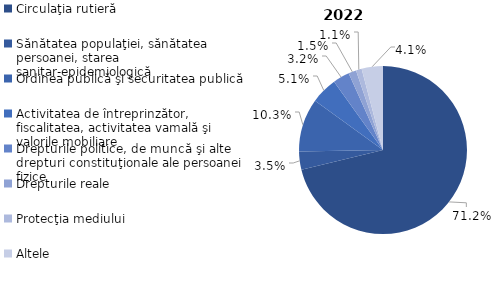
| Category | Series 0 |
|---|---|
| Circulaţia rutieră | 0.712 |
| Sănătatea populaţiei, sănătatea persoanei, starea sanitar-epidemiologică | 0.035 |
| Ordinea publică şi securitatea publică | 0.103 |
| Activitatea de întreprinzător, fiscalitatea, activitatea vamală şi valorile mobiliare | 0.051 |
| Drepturile politice, de muncă şi alte drepturi constituţionale ale persoanei fizice  | 0.032 |
| Drepturile reale | 0.015 |
| Protecţia mediului | 0.011 |
| Altele | 0.041 |